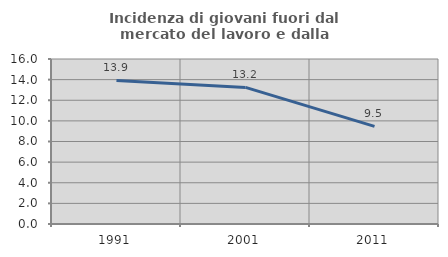
| Category | Incidenza di giovani fuori dal mercato del lavoro e dalla formazione  |
|---|---|
| 1991.0 | 13.917 |
| 2001.0 | 13.247 |
| 2011.0 | 9.467 |